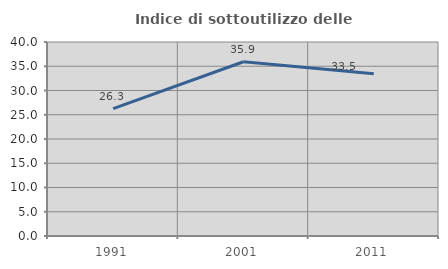
| Category | Indice di sottoutilizzo delle abitazioni  |
|---|---|
| 1991.0 | 26.25 |
| 2001.0 | 35.93 |
| 2011.0 | 33.47 |